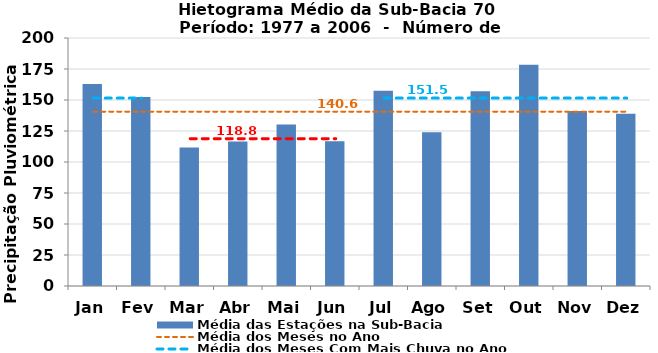
| Category | Média das Estações na Sub-Bacia |
|---|---|
| Jan | 162.836 |
| Fev | 152.463 |
| Mar | 111.637 |
| Abr | 116.455 |
| Mai | 130.155 |
| Jun | 116.812 |
| Jul | 157.481 |
| Ago | 123.953 |
| Set | 157.126 |
| Out | 178.377 |
| Nov | 141.108 |
| Dez | 138.846 |